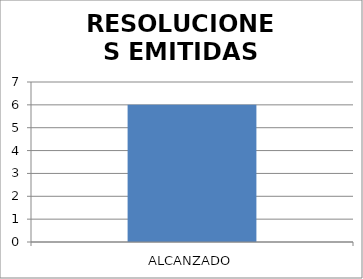
| Category | RESOLUCIONES EMITIDAS DSR |
|---|---|
| ALCANZADO | 6 |